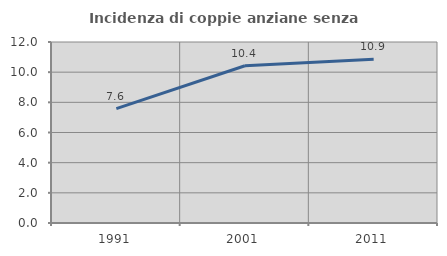
| Category | Incidenza di coppie anziane senza figli  |
|---|---|
| 1991.0 | 7.584 |
| 2001.0 | 10.428 |
| 2011.0 | 10.864 |